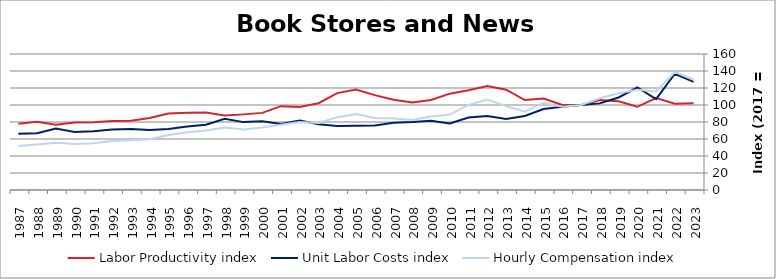
| Category | Labor Productivity index | Unit Labor Costs index | Hourly Compensation index |
|---|---|---|---|
| 2023.0 | 102.042 | 127.156 | 129.753 |
| 2022.0 | 101.507 | 136.802 | 138.863 |
| 2021.0 | 108.27 | 107.003 | 115.852 |
| 2020.0 | 97.903 | 120.581 | 118.052 |
| 2019.0 | 104.492 | 108.879 | 113.77 |
| 2018.0 | 105.822 | 101.914 | 107.848 |
| 2017.0 | 100 | 100 | 100 |
| 2016.0 | 100.116 | 97.976 | 98.089 |
| 2015.0 | 107.538 | 95.302 | 102.486 |
| 2014.0 | 105.821 | 87.085 | 92.154 |
| 2013.0 | 117.972 | 83.62 | 98.649 |
| 2012.0 | 122.295 | 86.939 | 106.322 |
| 2011.0 | 117.427 | 85.247 | 100.104 |
| 2010.0 | 113.355 | 78.221 | 88.667 |
| 2009.0 | 105.968 | 81.554 | 86.422 |
| 2008.0 | 102.984 | 79.958 | 82.344 |
| 2007.0 | 106.224 | 79.147 | 84.073 |
| 2006.0 | 111.592 | 75.954 | 84.758 |
| 2005.0 | 118.305 | 75.536 | 89.362 |
| 2004.0 | 114.019 | 75.168 | 85.706 |
| 2003.0 | 102.083 | 77.357 | 78.968 |
| 2002.0 | 97.783 | 81.73 | 79.918 |
| 2001.0 | 98.617 | 77.718 | 76.643 |
| 2000.0 | 90.731 | 80.908 | 73.409 |
| 1999.0 | 88.97 | 79.865 | 71.057 |
| 1998.0 | 87.614 | 83.828 | 73.446 |
| 1997.0 | 91.194 | 76.687 | 69.934 |
| 1996.0 | 90.911 | 74.701 | 67.912 |
| 1995.0 | 90.02 | 71.78 | 64.616 |
| 1994.0 | 84.655 | 70.528 | 59.705 |
| 1993.0 | 81.417 | 71.9 | 58.539 |
| 1992.0 | 81.146 | 71.06 | 57.662 |
| 1991.0 | 79.742 | 69.145 | 55.138 |
| 1990.0 | 79.333 | 68.249 | 54.144 |
| 1989.0 | 76.79 | 72.385 | 55.584 |
| 1988.0 | 80.238 | 66.784 | 53.586 |
| 1987.0 | 78.078 | 66.13 | 51.633 |